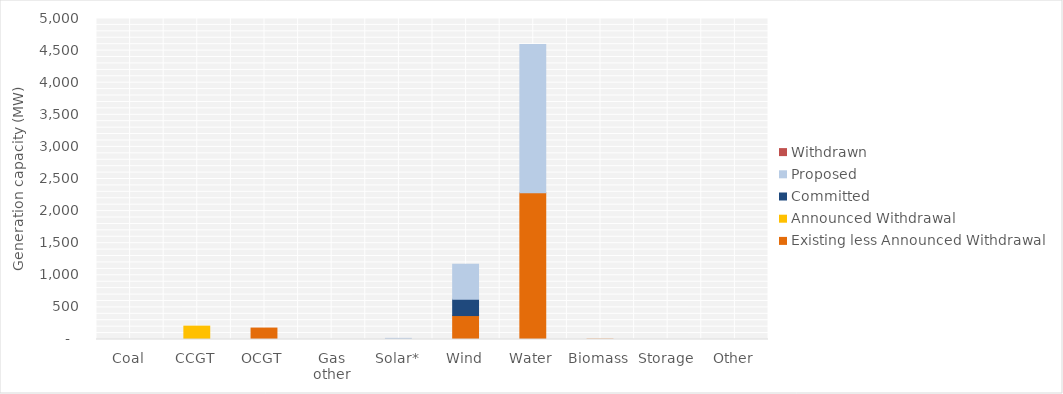
| Category | Existing less Announced Withdrawal | Announced Withdrawal | Committed | Proposed | Withdrawn |
|---|---|---|---|---|---|
| Coal | 0 | 0 | 0 | 0 | 0 |
| CCGT | 0 | 208 | 0 | 0 | 0 |
| OCGT | 178 | 0 | 0 | 0 | 0 |
| Gas other | 0 | 0 | 0 | 0 | 0 |
| Solar* | 0.265 | 0 | 0 | 17.5 | 0 |
| Wind | 372.75 | 0 | 255.6 | 542 | 0 |
| Water | 2286.8 | 0 | 0 | 2310 | 0 |
| Biomass | 4.936 | 0 | 0 | 0 | 0 |
| Storage | 0 | 0 | 0 | 0 | 0 |
| Other | 0 | 0 | 0 | 0 | 0 |